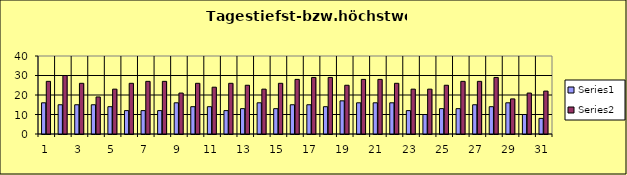
| Category | Series 0 | Series 1 |
|---|---|---|
| 0 | 16 | 27 |
| 1 | 15 | 30 |
| 2 | 15 | 26 |
| 3 | 15 | 19 |
| 4 | 14 | 23 |
| 5 | 12 | 26 |
| 6 | 12 | 27 |
| 7 | 12 | 27 |
| 8 | 16 | 21 |
| 9 | 14 | 26 |
| 10 | 14 | 24 |
| 11 | 12 | 26 |
| 12 | 13 | 25 |
| 13 | 16 | 23 |
| 14 | 13 | 26 |
| 15 | 15 | 28 |
| 16 | 15 | 29 |
| 17 | 14 | 29 |
| 18 | 17 | 25 |
| 19 | 16 | 28 |
| 20 | 16 | 28 |
| 21 | 16 | 26 |
| 22 | 12 | 23 |
| 23 | 10 | 23 |
| 24 | 13 | 25 |
| 25 | 13 | 27 |
| 26 | 15 | 27 |
| 27 | 14 | 29 |
| 28 | 16 | 18 |
| 29 | 10 | 21 |
| 30 | 8 | 22 |